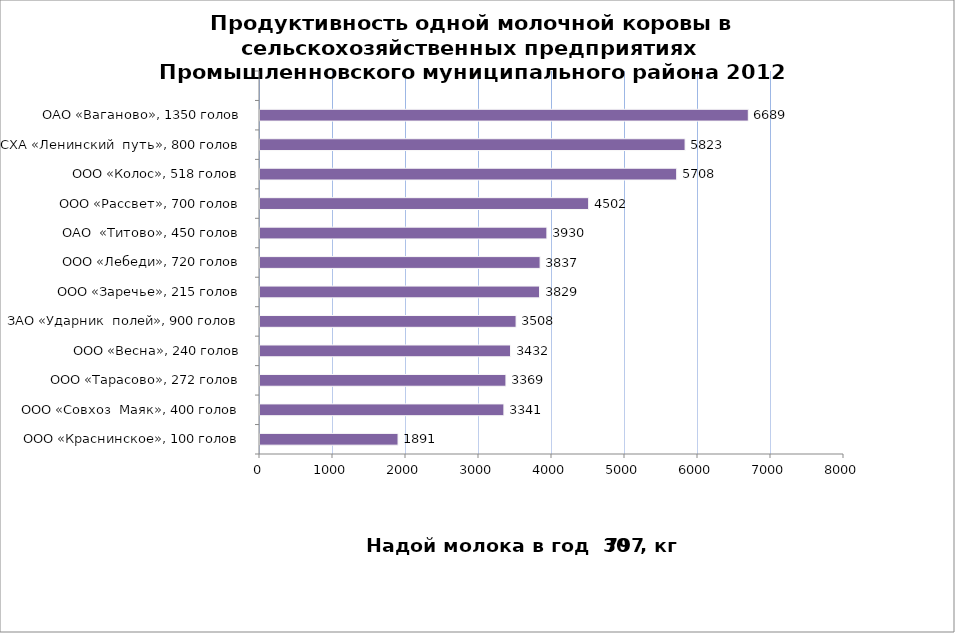
| Category | Series 0 |
|---|---|
| ООО «Краснинское», 100 голов | 1891 |
| ООО «Совхоз  Маяк», 400 голов | 3341 |
| ООО «Тарасово», 272 голов | 3369 |
| ООО «Весна», 240 голов | 3432 |
| ЗАО «Ударник  полей», 900 голов | 3508 |
| ООО «Заречье», 215 голов | 3829 |
| ООО «Лебеди», 720 голов | 3837 |
| ОАО  «Титово», 450 голов | 3930 |
| ООО «Рассвет», 700 голов | 4502 |
| ООО «Колос», 518 голов | 5708 |
| СХА «Ленинский  путь», 800 голов | 5823 |
| ОАО «Ваганово», 1350 голов | 6689 |